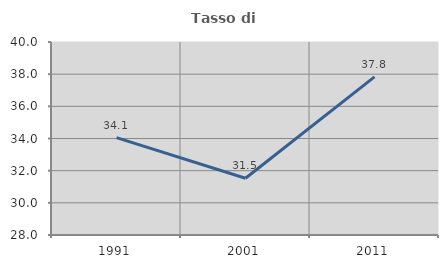
| Category | Tasso di occupazione   |
|---|---|
| 1991.0 | 34.058 |
| 2001.0 | 31.532 |
| 2011.0 | 37.834 |